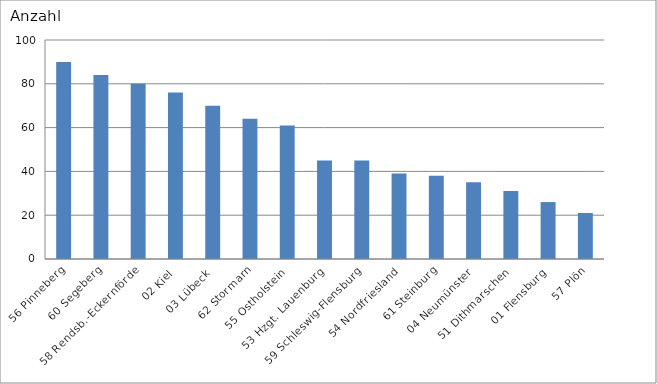
| Category | 56 Pinneberg |
|---|---|
| 56 Pinneberg | 90 |
| 60 Segeberg | 84 |
| 58 Rendsb.-Eckernförde | 80 |
| 02 Kiel | 76 |
| 03 Lübeck | 70 |
| 62 Stormarn | 64 |
| 55 Ostholstein | 61 |
| 53 Hzgt. Lauenburg | 45 |
| 59 Schleswig-Flensburg | 45 |
| 54 Nordfriesland | 39 |
| 61 Steinburg | 38 |
| 04 Neumünster | 35 |
| 51 Dithmarschen | 31 |
| 01 Flensburg | 26 |
| 57 Plön | 21 |